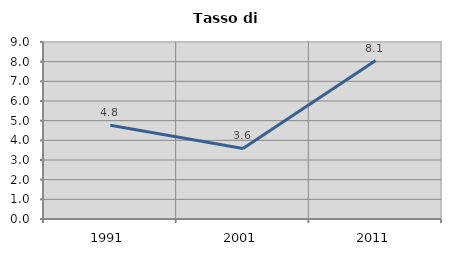
| Category | Tasso di disoccupazione   |
|---|---|
| 1991.0 | 4.766 |
| 2001.0 | 3.587 |
| 2011.0 | 8.053 |